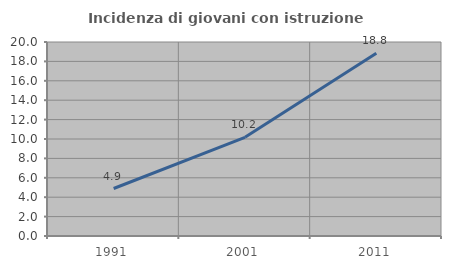
| Category | Incidenza di giovani con istruzione universitaria |
|---|---|
| 1991.0 | 4.895 |
| 2001.0 | 10.175 |
| 2011.0 | 18.841 |